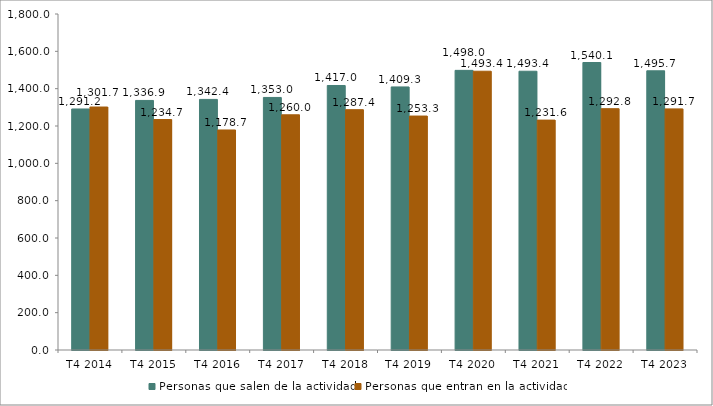
| Category | Personas que salen de la actividad | Personas que entran en la actividad |
|---|---|---|
| T4 2014 | 1291.2 | 1301.7 |
| T4 2015 | 1336.9 | 1234.7 |
| T4 2016 | 1342.4 | 1178.7 |
| T4 2017 | 1353 | 1260 |
| T4 2018 | 1417 | 1287.4 |
| T4 2019 | 1409.3 | 1253.3 |
| T4 2020 | 1498 | 1493.4 |
| T4 2021 | 1493.4 | 1231.6 |
| T4 2022 | 1540.1 | 1292.8 |
| T4 2023 | 1495.7 | 1291.7 |